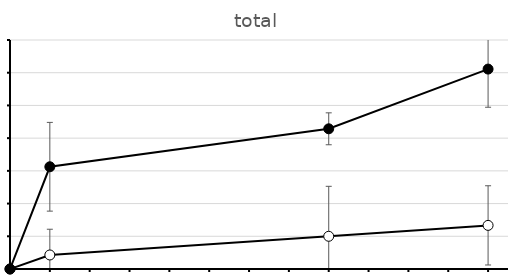
| Category | Series 0 | Series 1 |
|---|---|---|
| 0.0 | 0 | 0 |
| 2.0 | 0.429 | 3.125 |
| 16.0 | 1 | 4.286 |
| 24.0 | 1.333 | 6.111 |